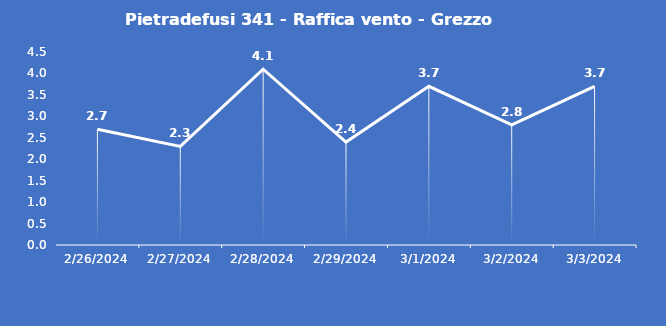
| Category | Pietradefusi 341 - Raffica vento - Grezzo (m/s) |
|---|---|
| 2/26/24 | 2.7 |
| 2/27/24 | 2.3 |
| 2/28/24 | 4.1 |
| 2/29/24 | 2.4 |
| 3/1/24 | 3.7 |
| 3/2/24 | 2.8 |
| 3/3/24 | 3.7 |